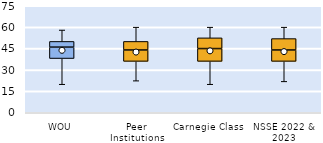
| Category | 25th | 50th | 75th |
|---|---|---|---|
| WOU | 38 | 8 | 4 |
| Peer Institutions | 36 | 8 | 6 |
| Carnegie Class | 36 | 9 | 7.5 |
| NSSE 2022 & 2023 | 36 | 8 | 8 |